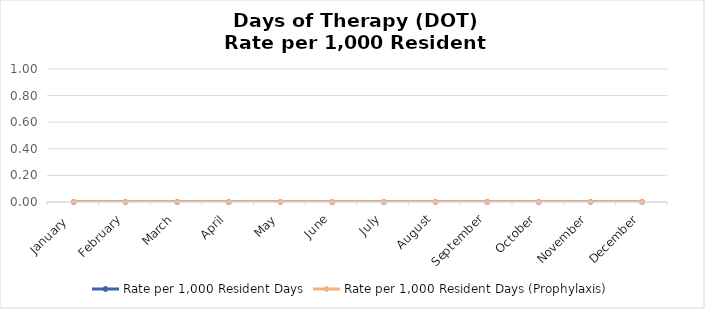
| Category | Rate per 1,000 Resident Days | Rate per 1,000 Resident Days (Prophylaxis) |
|---|---|---|
| January  | 0 | 0 |
| February | 0 | 0 |
| March | 0 | 0 |
| April | 0 | 0 |
| May | 0 | 0 |
| June | 0 | 0 |
| July | 0 | 0 |
| August | 0 | 0 |
| September | 0 | 0 |
| October | 0 | 0 |
| November | 0 | 0 |
| December | 0 | 0 |